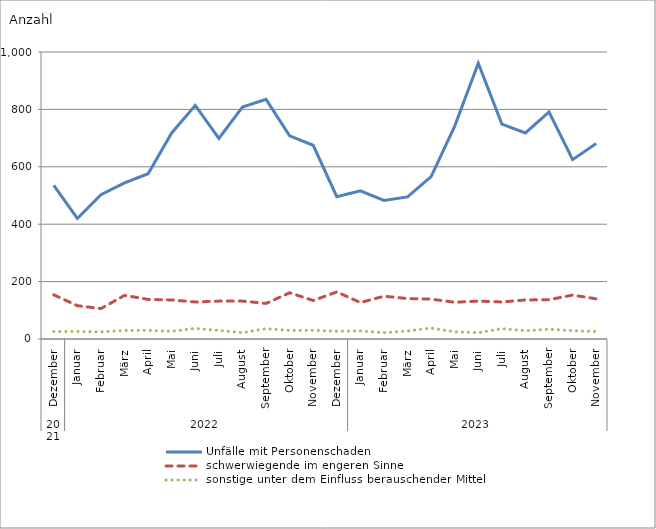
| Category | Unfälle mit Personenschaden | schwerwiegende im engeren Sinne | sonstige unter dem Einfluss berauschender Mittel |
|---|---|---|---|
| 0 | 535 | 154 | 26 |
| 1 | 420 | 116 | 26 |
| 2 | 503 | 106 | 25 |
| 3 | 544 | 152 | 30 |
| 4 | 576 | 138 | 30 |
| 5 | 718 | 136 | 27 |
| 6 | 814 | 129 | 37 |
| 7 | 699 | 132 | 30 |
| 8 | 808 | 132 | 22 |
| 9 | 835 | 124 | 36 |
| 10 | 708 | 161 | 30 |
| 11 | 675 | 134 | 30 |
| 12 | 496 | 164 | 27 |
| 13 | 516 | 127 | 28 |
| 14 | 483 | 149 | 22 |
| 15 | 495 | 141 | 28 |
| 16 | 566 | 139 | 38 |
| 17 | 742 | 128 | 25 |
| 18 | 961 | 132 | 22 |
| 19 | 749 | 129 | 36 |
| 20 | 718 | 136 | 29 |
| 21 | 791 | 137 | 34 |
| 22 | 625 | 153 | 29 |
| 23 | 681 | 140 | 26 |